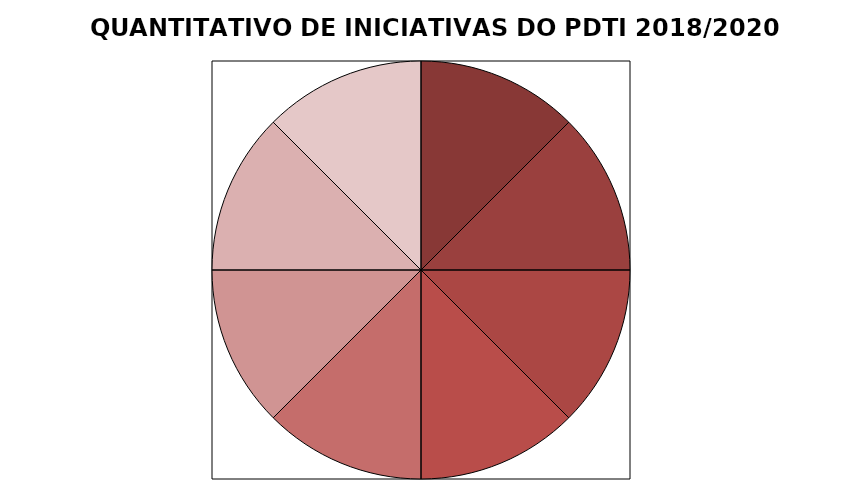
| Category | Cont.Núm - CATEGORIA |
|---|---|
| 1.0 | 1 |
| 2.0 | 1 |
| 3.0 | 1 |
| 5.0 | 1 |
| 6.0 | 1 |
| 7.0 | 1 |
| 9.0 | 1 |
| 10.0 | 1 |